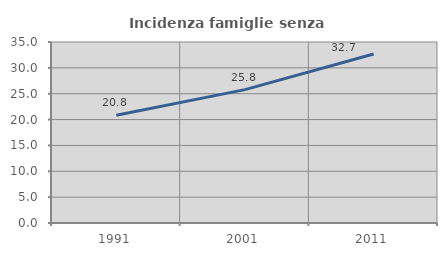
| Category | Incidenza famiglie senza nuclei |
|---|---|
| 1991.0 | 20.844 |
| 2001.0 | 25.796 |
| 2011.0 | 32.667 |